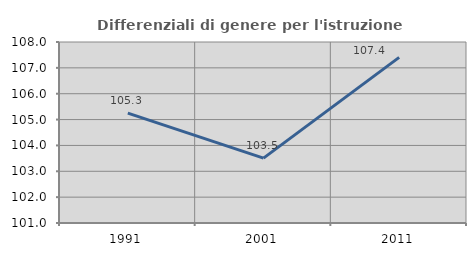
| Category | Differenziali di genere per l'istruzione superiore |
|---|---|
| 1991.0 | 105.251 |
| 2001.0 | 103.509 |
| 2011.0 | 107.406 |